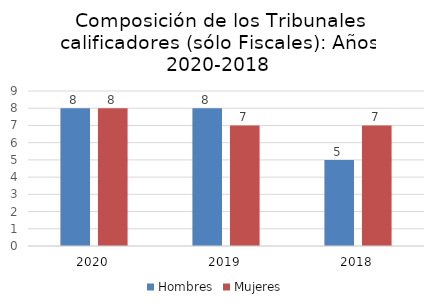
| Category | Hombres | Mujeres |
|---|---|---|
| 0 | 8 | 8 |
| 1 | 8 | 7 |
| 2 | 5 | 7 |